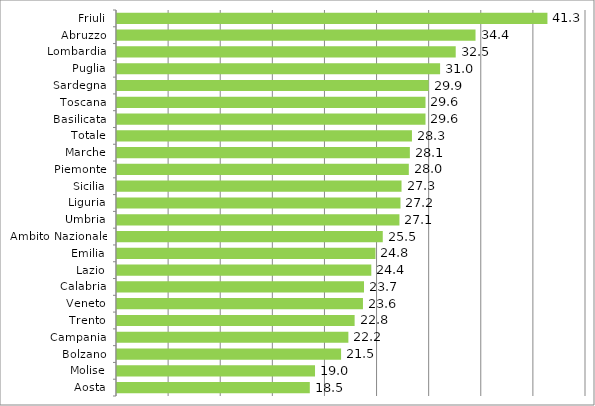
| Category | Series 0 |
|---|---|
| Friuli | 41.3 |
| Abruzzo | 34.4 |
| Lombardia | 32.5 |
| Puglia | 31 |
| Sardegna | 29.9 |
| Toscana | 29.6 |
| Basilicata | 29.6 |
| Totale | 28.3 |
| Marche | 28.1 |
| Piemonte | 28 |
| Sicilia | 27.3 |
| Liguria | 27.2 |
| Umbria | 27.1 |
| Ambito Nazionale | 25.5 |
| Emilia | 24.8 |
| Lazio | 24.4 |
| Calabria | 23.7 |
| Veneto | 23.6 |
| Trento | 22.8 |
| Campania | 22.2 |
| Bolzano | 21.5 |
| Molise | 19 |
| Aosta | 18.5 |